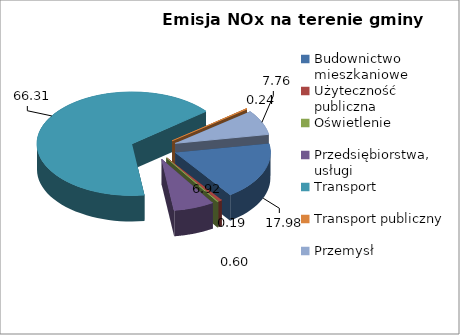
| Category | Budownictwo mieszkaniowe Użyteczność publiczna Oświetlenie Przedsiębiorstwa, usługi Transport Transport publiczny Przemysł |
|---|---|
| Budownictwo mieszkaniowe | 17.985 |
| Użyteczność publiczna | 0.596 |
| Oświetlenie | 0.186 |
| Przedsiębiorstwa, usługi | 6.922 |
| Transport | 66.309 |
| Transport publiczny | 0.244 |
| Przemysł | 7.758 |